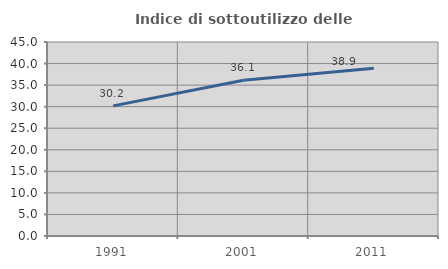
| Category | Indice di sottoutilizzo delle abitazioni  |
|---|---|
| 1991.0 | 30.178 |
| 2001.0 | 36.141 |
| 2011.0 | 38.889 |